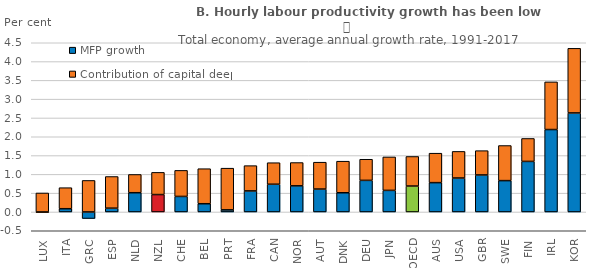
| Category | MFP growth | Contribution of capital deepening |
|---|---|---|
| LUX | -0.021 | 0.505 |
| ITA | 0.086 | 0.559 |
| GRC | -0.174 | 0.838 |
| ESP | 0.101 | 0.842 |
| NLD | 0.512 | 0.485 |
| NZL | 0.463 | 0.59 |
| CHE | 0.413 | 0.692 |
| BEL | 0.219 | 0.932 |
| PRT | 0.056 | 1.109 |
| FRA | 0.559 | 0.673 |
| CAN | 0.737 | 0.573 |
| NOR | 0.695 | 0.619 |
| AUT | 0.609 | 0.715 |
| DNK | 0.511 | 0.84 |
| DEU | 0.84 | 0.562 |
| JPN | 0.574 | 0.89 |
| OECD | 0.689 | 0.787 |
| AUS | 0.78 | 0.783 |
| USA | 0.903 | 0.708 |
| GBR | 0.984 | 0.646 |
| SWE | 0.833 | 0.933 |
| FIN | 1.344 | 0.61 |
| IRL | 2.192 | 1.268 |
| KOR | 2.633 | 1.719 |